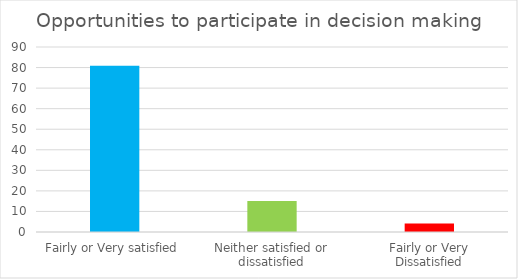
| Category | Series 0 |
|---|---|
| Fairly or Very satisfied | 80.82 |
| Neither satisfied or dissatisfied | 15.07 |
| Fairly or Very Dissatisfied | 4.11 |